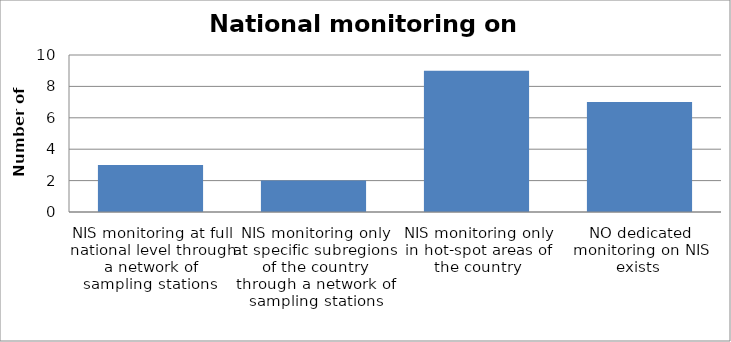
| Category | Member States |
|---|---|
| NIS monitoring at full national level through a network of sampling stations  | 3 |
| NIS monitoring only at specific subregions of the country through a network of sampling stations | 2 |
| NIS monitoring only in hot-spot areas of the country | 9 |
| NO dedicated monitoring on NIS exists  | 7 |